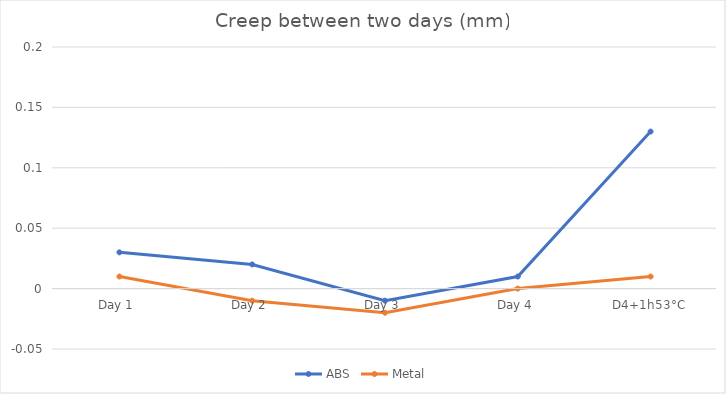
| Category | ABS | Metal |
|---|---|---|
| Day 1 | 0.03 | 0.01 |
| Day 2 | 0.02 | -0.01 |
| Day 3 | -0.01 | -0.02 |
| Day 4 | 0.01 | 0 |
| D4+1h53°C | 0.13 | 0.01 |